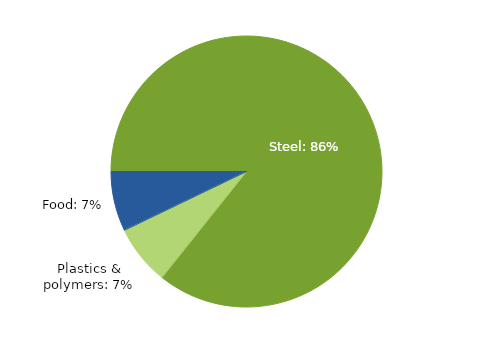
| Category | Series 0 |
|---|---|
| Steel | 85.714 |
| Plastics & polymers | 7.143 |
| Food | 7.143 |